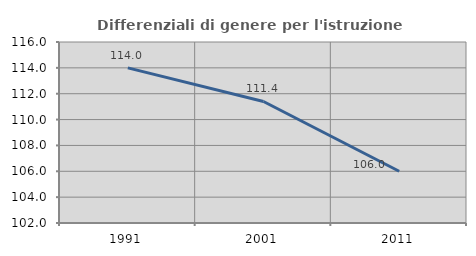
| Category | Differenziali di genere per l'istruzione superiore |
|---|---|
| 1991.0 | 114 |
| 2001.0 | 111.398 |
| 2011.0 | 106 |